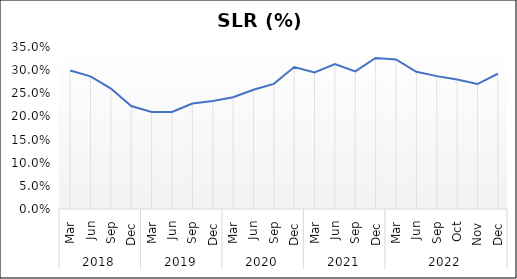
| Category | SLR |
|---|---|
| 0 | 0.299 |
| 1 | 0.286 |
| 2 | 0.26 |
| 3 | 0.222 |
| 4 | 0.21 |
| 5 | 0.21 |
| 6 | 0.228 |
| 7 | 0.233 |
| 8 | 0.241 |
| 9 | 0.258 |
| 10 | 0.27 |
| 11 | 0.307 |
| 12 | 0.295 |
| 13 | 0.313 |
| 14 | 0.297 |
| 15 | 0.326 |
| 16 | 0.323 |
| 17 | 0.297 |
| 18 | 0.287 |
| 19 | 0.28 |
| 20 | 0.27 |
| 21 | 0.292 |